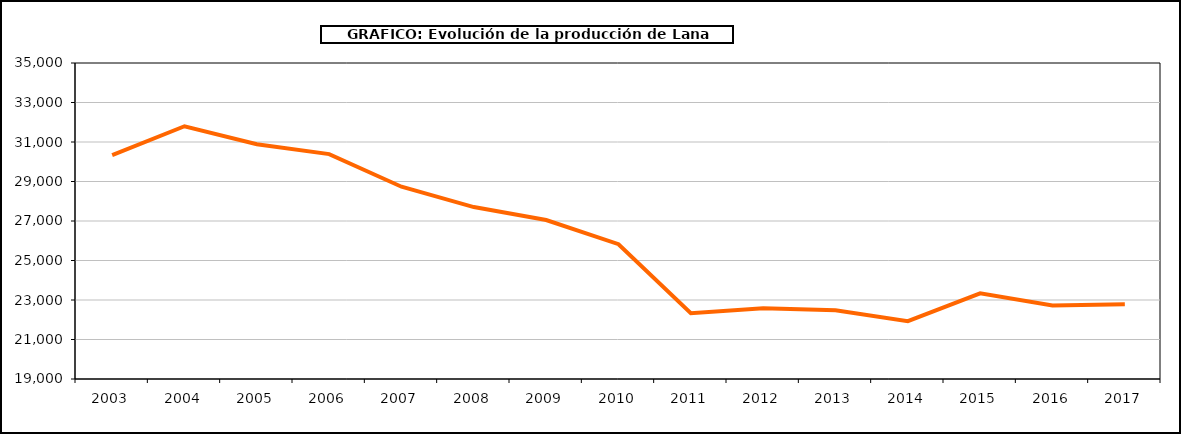
| Category | Lana |
|---|---|
| 2003.0 | 30340.64 |
| 2004.0 | 31796.74 |
| 2005.0 | 30888.43 |
| 2006.0 | 30387.145 |
| 2007.0 | 28736.496 |
| 2008.0 | 27705.371 |
| 2009.0 | 27048.693 |
| 2010.0 | 25825 |
| 2011.0 | 22333.5 |
| 2012.0 | 22583.2 |
| 2013.0 | 22476.583 |
| 2014.0 | 21929.646 |
| 2015.0 | 23336.469 |
| 2016.0 | 22723.741 |
| 2017.0 | 22788.995 |